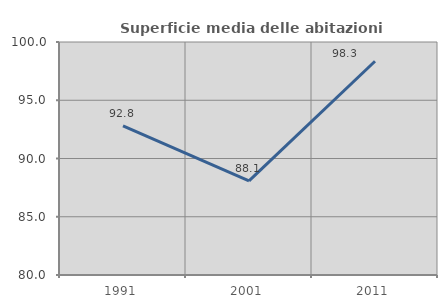
| Category | Superficie media delle abitazioni occupate |
|---|---|
| 1991.0 | 92.799 |
| 2001.0 | 88.078 |
| 2011.0 | 98.35 |